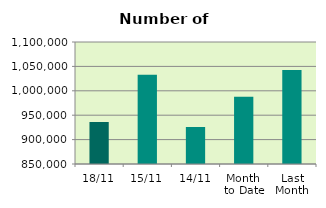
| Category | Series 0 |
|---|---|
| 18/11 | 936084 |
| 15/11 | 1032638 |
| 14/11 | 925820 |
| Month 
to Date | 987577.167 |
| Last
Month | 1042648 |